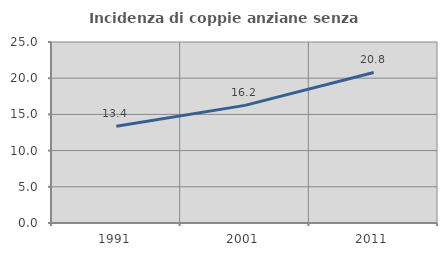
| Category | Incidenza di coppie anziane senza figli  |
|---|---|
| 1991.0 | 13.376 |
| 2001.0 | 16.245 |
| 2011.0 | 20.792 |